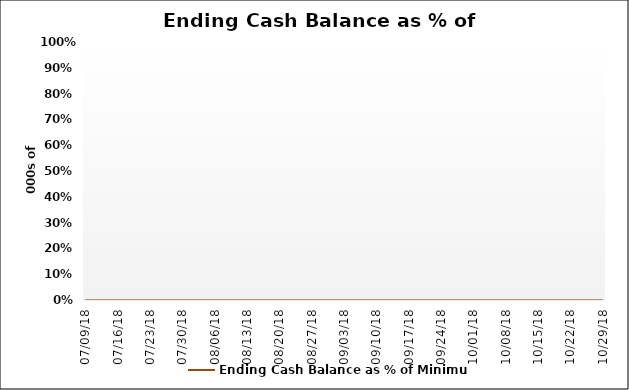
| Category | Ending Cash Balance as % of Minimum  |
|---|---|
| 2018-07-09 | 0 |
| 2018-07-16 | 0 |
| 2018-07-23 | 0 |
| 2018-07-30 | 0 |
| 2018-08-06 | 0 |
| 2018-08-13 | 0 |
| 2018-08-20 | 0 |
| 2018-08-27 | 0 |
| 2018-09-03 | 0 |
| 2018-09-10 | 0 |
| 2018-09-17 | 0 |
| 2018-09-24 | 0 |
| 2018-10-01 | 0 |
| 2018-10-08 | 0 |
| 2018-10-15 | 0 |
| 2018-10-22 | 0 |
| 2018-10-29 | 0 |